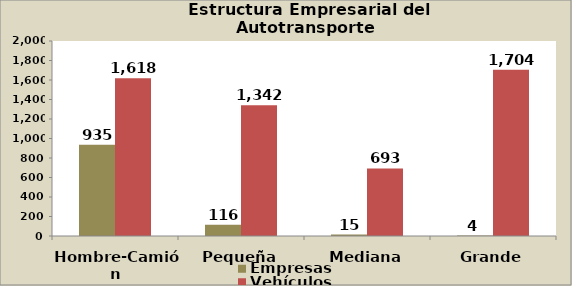
| Category | Empresas | Vehículos |
|---|---|---|
| Hombre-Camión | 935 | 1618 |
| Pequeña | 116 | 1342 |
| Mediana | 15 | 693 |
| Grande | 4 | 1704 |